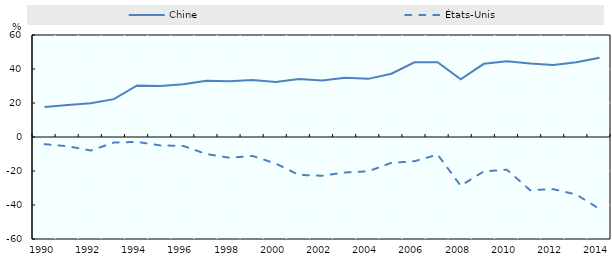
| Category | Chine | États-Unis |
|---|---|---|
| 1990.0 | 17.595 | -4.213 |
| 1991.0 | 18.765 | -5.44 |
| 1992.0 | 19.874 | -7.941 |
| 1993.0 | 22.271 | -3.262 |
| 1994.0 | 30.358 | -2.879 |
| 1995.0 | 30.016 | -4.943 |
| 1996.0 | 30.969 | -5.247 |
| 1997.0 | 33.058 | -10.038 |
| 1998.0 | 32.831 | -12.202 |
| 1999.0 | 33.599 | -11.161 |
| 2000.0 | 32.359 | -15.641 |
| 2001.0 | 34.087 | -22.288 |
| 2002.0 | 33.268 | -22.788 |
| 2003.0 | 34.913 | -20.865 |
| 2004.0 | 34.195 | -20.18 |
| 2005.0 | 37.201 | -15.212 |
| 2006.0 | 43.967 | -14.243 |
| 2007.0 | 43.935 | -10.341 |
| 2008.0 | 33.896 | -28.688 |
| 2009.0 | 43.046 | -20.194 |
| 2010.0 | 44.602 | -19.239 |
| 2011.0 | 43.189 | -31.287 |
| 2012.0 | 42.412 | -30.647 |
| 2013.0 | 43.98 | -33.861 |
| 2014.0 | 46.616 | -42.281 |